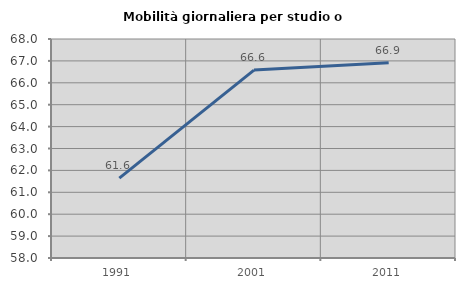
| Category | Mobilità giornaliera per studio o lavoro |
|---|---|
| 1991.0 | 61.647 |
| 2001.0 | 66.58 |
| 2011.0 | 66.915 |